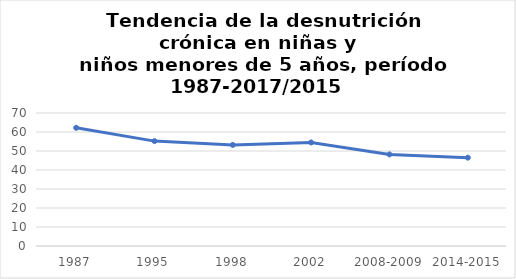
| Category | Valor |
|---|---|
| 1987 | 62.2 |
| 1995 | 55.2 |
| 1998 | 53.2 |
| 2002 | 54.5 |
| 2008-2009 | 48.2 |
| 2014-2015 | 46.5 |